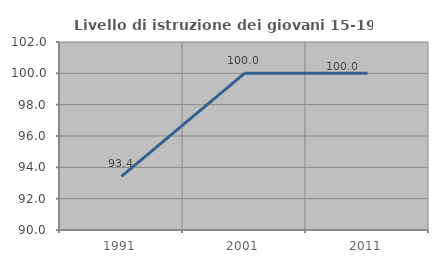
| Category | Livello di istruzione dei giovani 15-19 anni |
|---|---|
| 1991.0 | 93.421 |
| 2001.0 | 100 |
| 2011.0 | 100 |